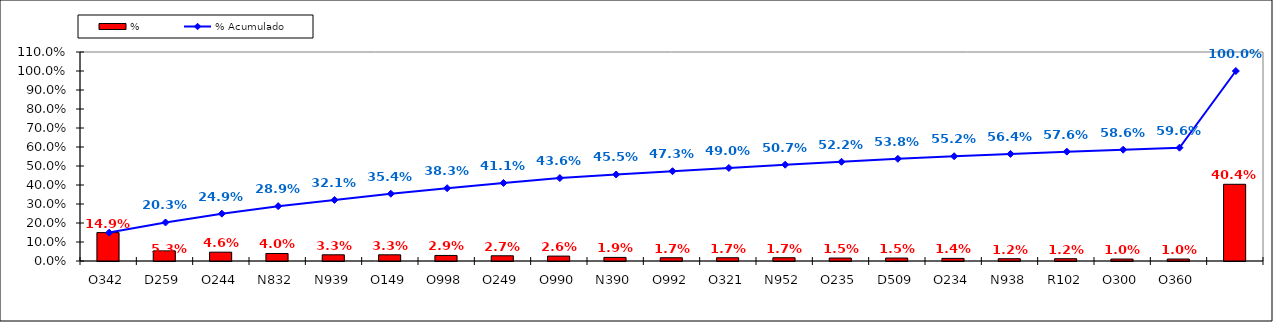
| Category | % |
|---|---|
| O342 | 0.149 |
| D259 | 0.053 |
| O244 | 0.046 |
| N832 | 0.04 |
| N939 | 0.033 |
| O149 | 0.033 |
| O998 | 0.029 |
| O249 | 0.027 |
| O990 | 0.026 |
| N390 | 0.019 |
| O992 | 0.017 |
| O321 | 0.017 |
| N952 | 0.017 |
| O235 | 0.015 |
| D509 | 0.015 |
| O234 | 0.014 |
| N938 | 0.012 |
| R102 | 0.012 |
| O300 | 0.01 |
| O360 | 0.01 |